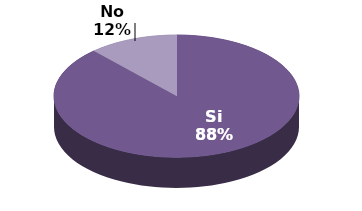
| Category | Series 1 | Series 0 |
|---|---|---|
| Si | 15 | 88.2 |
| No | 2 | 11.8 |